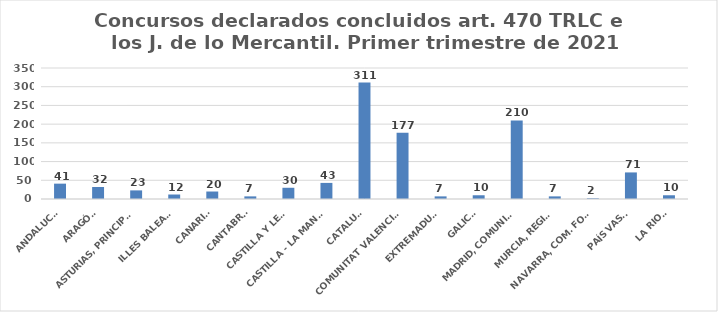
| Category | Series 0 |
|---|---|
| ANDALUCÍA | 41 |
| ARAGÓN | 32 |
| ASTURIAS, PRINCIPADO | 23 |
| ILLES BALEARS | 12 |
| CANARIAS | 20 |
| CANTABRIA | 7 |
| CASTILLA Y LEÓN | 30 |
| CASTILLA - LA MANCHA | 43 |
| CATALUÑA | 311 |
| COMUNITAT VALENCIANA | 177 |
| EXTREMADURA | 7 |
| GALICIA | 10 |
| MADRID, COMUNIDAD | 210 |
| MURCIA, REGIÓN | 7 |
| NAVARRA, COM. FORAL | 2 |
| PAÍS VASCO | 71 |
| LA RIOJA | 10 |